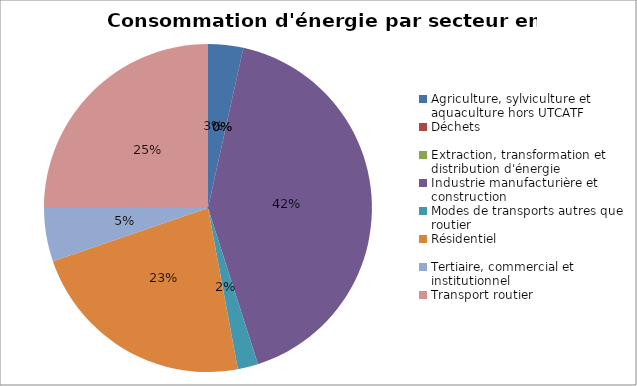
| Category | Series 0 |
|---|---|
| Agriculture, sylviculture et aquaculture hors UTCATF | 47448.65 |
| Déchets | 0 |
| Extraction, transformation et distribution d'énergie | 0 |
| Industrie manufacturière et construction | 569437.186 |
| Modes de transports autres que routier | 27589.839 |
| Résidentiel | 310018.404 |
| Tertiaire, commercial et institutionnel | 71964.684 |
| Transport routier | 342282.001 |